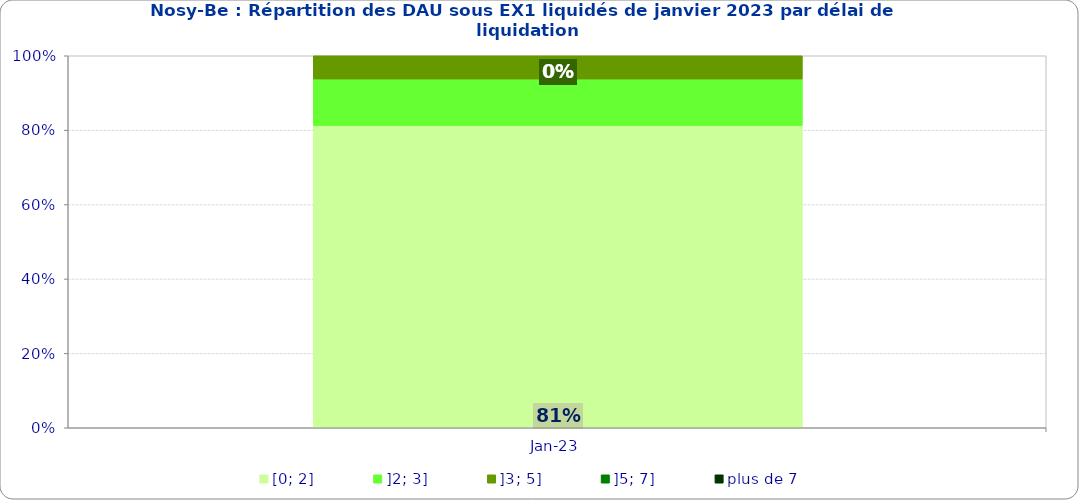
| Category | [0; 2] | ]2; 3] | ]3; 5] | ]5; 7] | plus de 7 |
|---|---|---|---|---|---|
| 2023-01-01 | 0.812 | 0.125 | 0.062 | 0 | 0 |